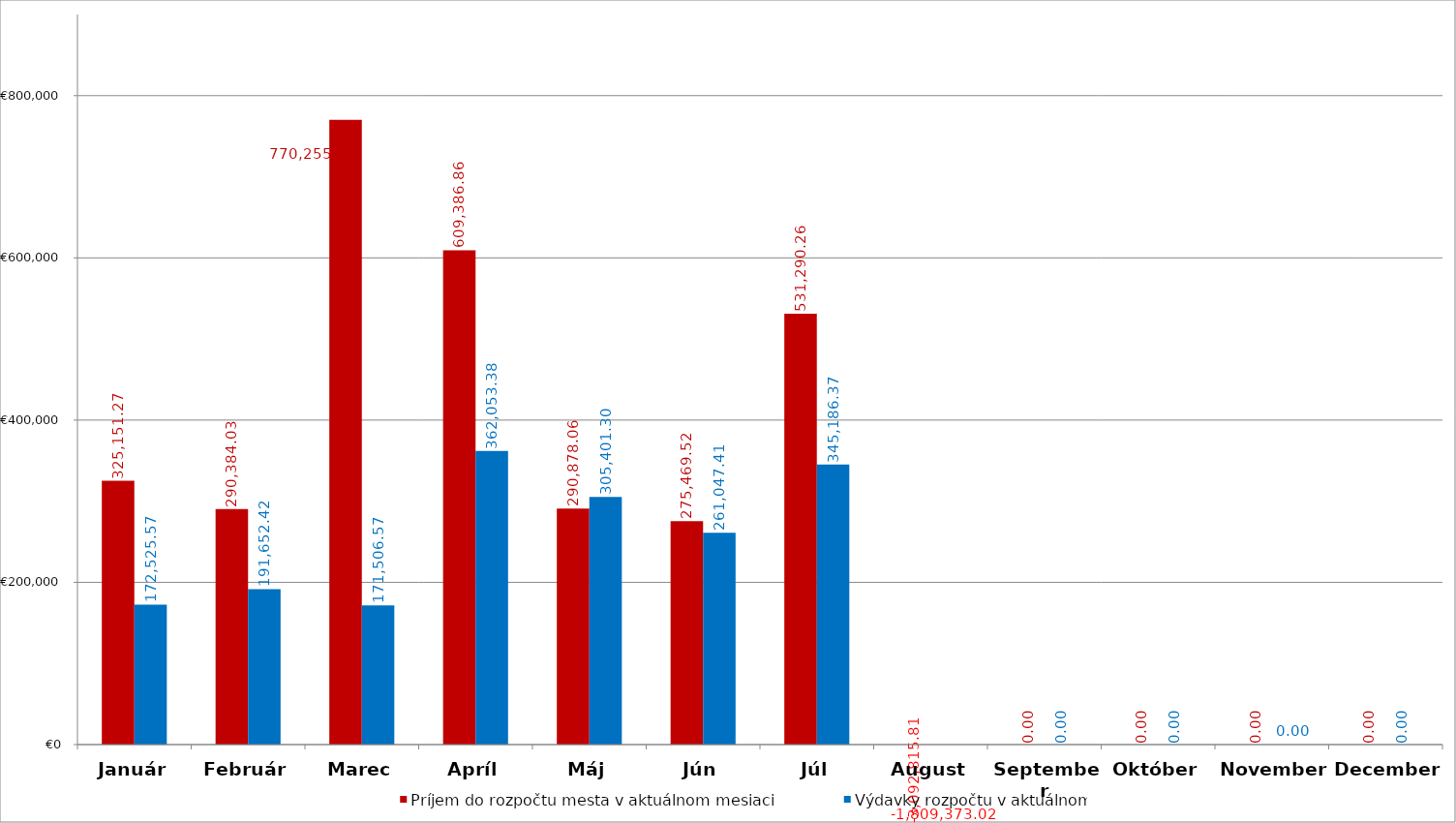
| Category | Príjem do rozpočtu mesta v aktuálnom mesiaci | Výdavky rozpočtu v aktuálnom  mesiaci |
|---|---|---|
| Január | 325151.27 | 172525.57 |
| Február | 290384.03 | 191652.42 |
| Marec | 770255.81 | 171506.57 |
| Apríl | 609386.86 | 362053.38 |
| Máj | 290878.06 | 305401.3 |
| Jún | 275469.52 | 261047.41 |
| Júl | 531290.26 | 345186.37 |
| August | -3092815.81 | -1809373.02 |
| September | 0 | 0 |
| Október | 0 | 0 |
| November | 0 | 0 |
| December | 0 | 0 |